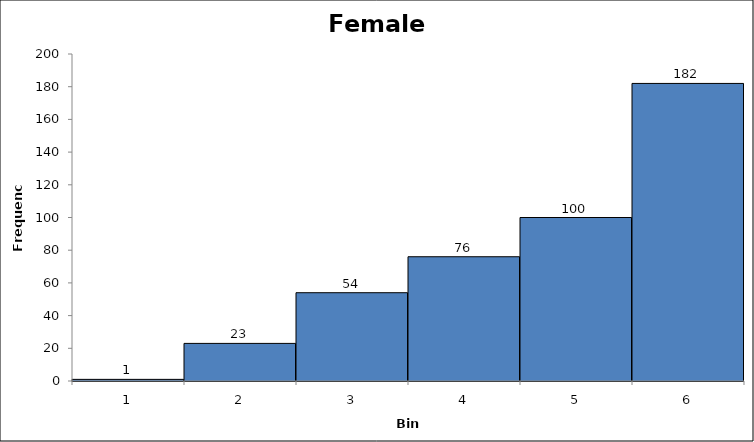
| Category | Series 1 |
|---|---|
| 0 | 1 |
| 1 | 23 |
| 2 | 54 |
| 3 | 76 |
| 4 | 100 |
| 5 | 182 |